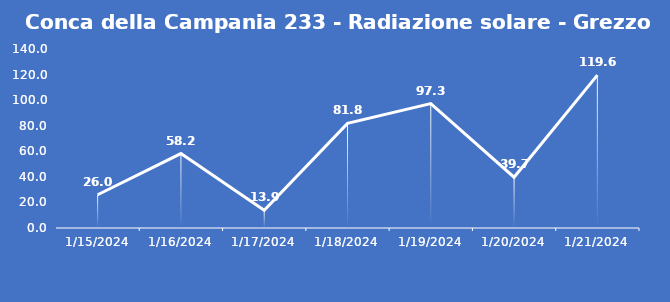
| Category | Conca della Campania 233 - Radiazione solare - Grezzo (W/m2) |
|---|---|
| 1/15/24 | 26 |
| 1/16/24 | 58.2 |
| 1/17/24 | 13.9 |
| 1/18/24 | 81.8 |
| 1/19/24 | 97.3 |
| 1/20/24 | 39.7 |
| 1/21/24 | 119.6 |